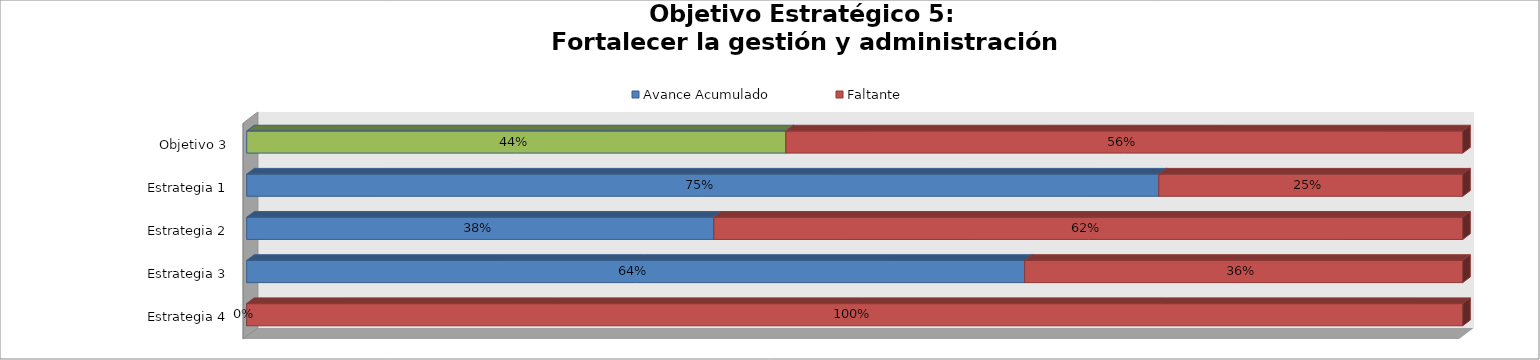
| Category | Avance Acumulado | Faltante |
|---|---|---|
| Estrategia 4 | 0 | 1 |
| Estrategia 3 | 0.64 | 0.36 |
| Estrategia 2 | 0.384 | 0.616 |
| Estrategia 1 | 0.75 | 0.25 |
| Objetivo 3 | 0.443 | 0.557 |